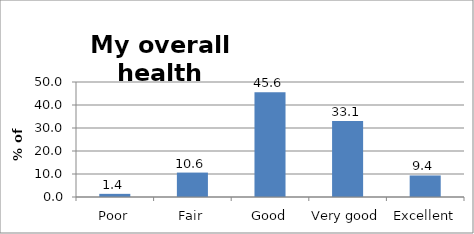
| Category | Series 0 |
|---|---|
| Poor | 1.368 |
| Fair | 10.622 |
| Good | 45.553 |
| Very good | 33.097 |
| Excellent | 9.361 |